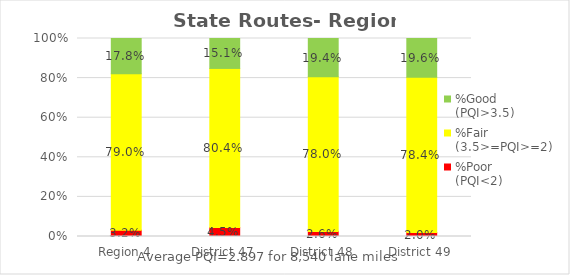
| Category | %Poor
(PQI<2) | %Fair
(3.5>=PQI>=2) | %Good
(PQI>3.5) |
|---|---|---|---|
| Region 4 | 0.032 | 0.79 | 0.178 |
| District 47 | 0.045 | 0.804 | 0.151 |
| District 48 | 0.026 | 0.78 | 0.194 |
| District 49 | 0.02 | 0.784 | 0.196 |